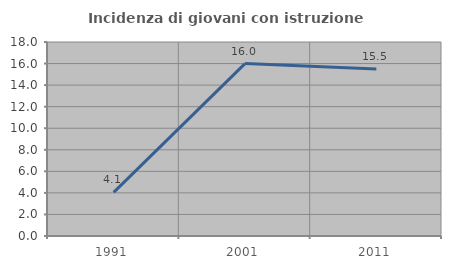
| Category | Incidenza di giovani con istruzione universitaria |
|---|---|
| 1991.0 | 4.054 |
| 2001.0 | 16 |
| 2011.0 | 15.493 |